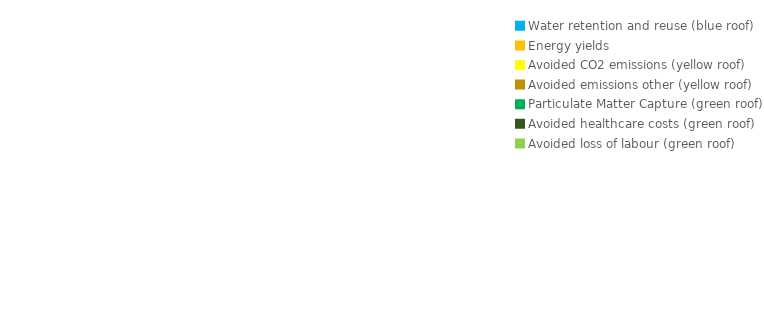
| Category | Series 0 |
|---|---|
| Water retention and reuse (blue roof)
 | 0 |
| Energy yields | 0 |
| Avoided CO2 emissions (yellow roof)
 | 0 |
| Avoided emissions other (yellow roof)
 | 0 |
| Particulate Matter Capture (green roof)
 | 0 |
| Avoided healthcare costs (green roof)
 | 0 |
| Avoided loss of labour (green roof)
 | 0 |